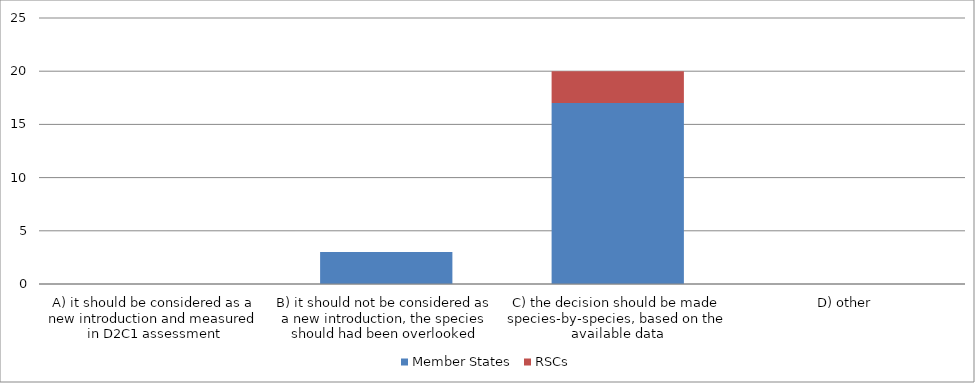
| Category | Member States | RSCs |
|---|---|---|
| A) it should be considered as a new introduction and measured in D2C1 assessment | 0 | 0 |
| B) it should not be considered as a new introduction, the species should had been overlooked | 3 | 0 |
| C) the decision should be made species-by-species, based on the available data | 17 | 3 |
| D) other  | 0 | 0 |